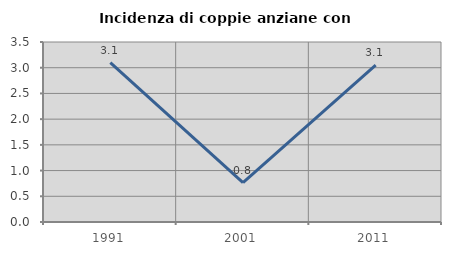
| Category | Incidenza di coppie anziane con figli |
|---|---|
| 1991.0 | 3.097 |
| 2001.0 | 0.766 |
| 2011.0 | 3.051 |